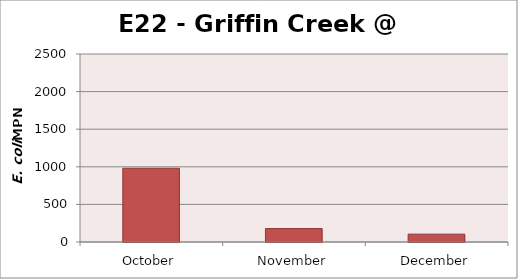
| Category | Series 0 |
|---|---|
| October | 980.4 |
| November | 178.5 |
| December | 104.6 |